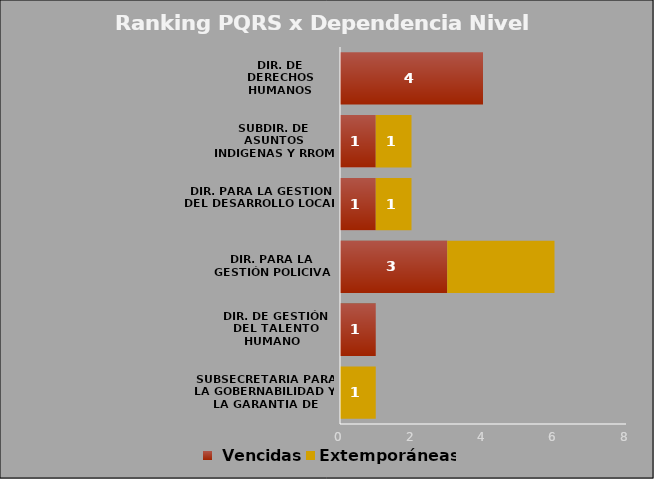
| Category |  Vencidas | Extemporáneas |
|---|---|---|
| SUBSECRETARIA PARA LA GOBERNABILIDAD Y LA GARANTIA DE DERECHOS | 0 | 1 |
| DIR. DE GESTIÓN DEL TALENTO HUMANO  | 1 | 0 |
| DIR. PARA LA GESTIÓN POLICIVA | 3 | 3 |
| DIR. PARA LA GESTION DEL DESARROLLO LOCAL | 1 | 1 |
| SUBDIR. DE ASUNTOS INDIGENAS Y RROM | 1 | 1 |
| DIR. DE DERECHOS HUMANOS | 4 | 0 |